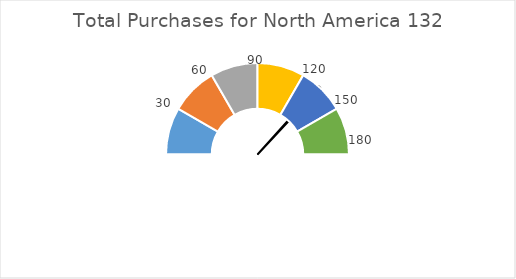
| Category | Needle |
|---|---|
| 0 | 132 |
| 1 | 1 |
| 2 | 227 |